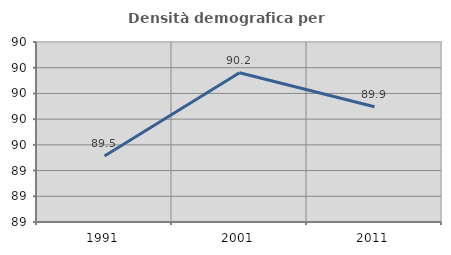
| Category | Densità demografica |
|---|---|
| 1991.0 | 89.514 |
| 2001.0 | 90.161 |
| 2011.0 | 89.896 |